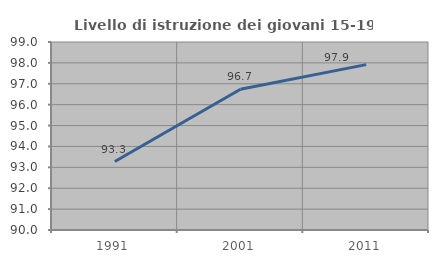
| Category | Livello di istruzione dei giovani 15-19 anni |
|---|---|
| 1991.0 | 93.277 |
| 2001.0 | 96.739 |
| 2011.0 | 97.917 |